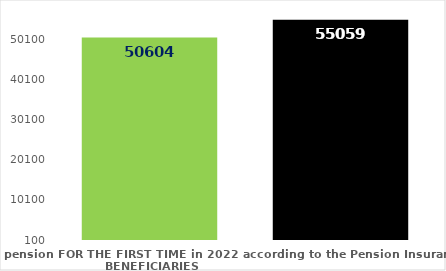
| Category | broj korisnika |
|---|---|
| Pension beneficiaries entitled to pension FOR THE FIRST TIME in 2022 according to the Pension Insurance Act  - NEW BENEFICIARIES | 50604 |
| Pension beneficiaries whose pension entitlement ceased in 2022  -  death caused,   
and who were retired according to the Pension Insurance Act   | 55059 |